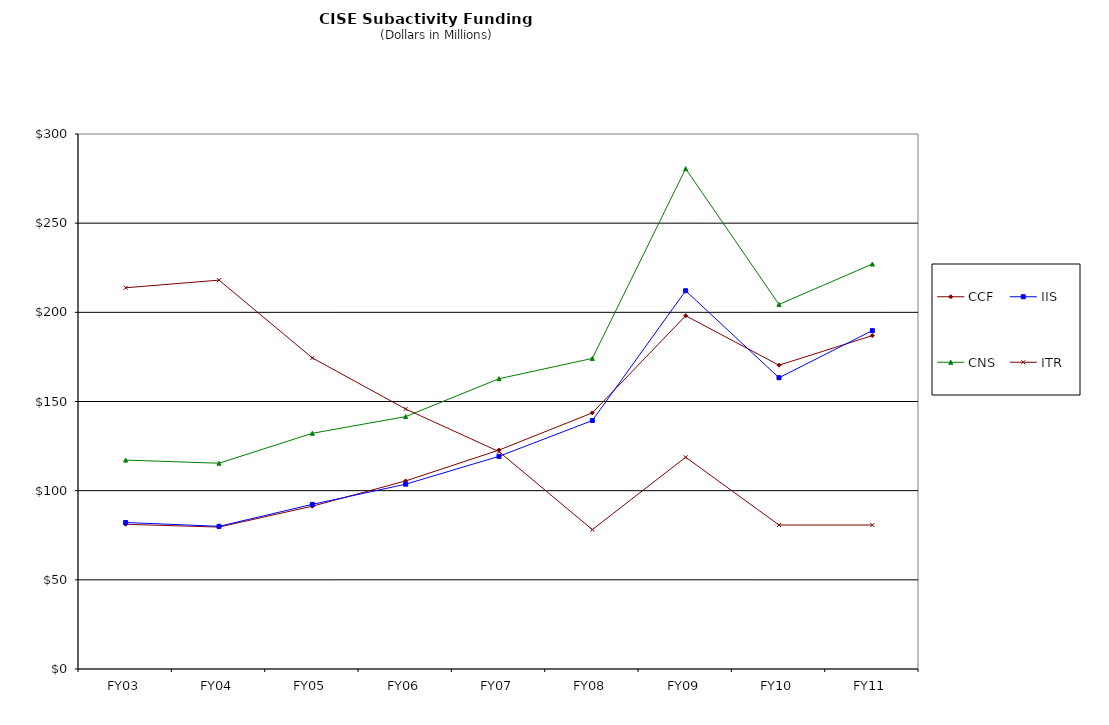
| Category | CCF | IIS | CNS | ITR |
|---|---|---|---|---|
| FY03 | 81.15 | 82.15 | 117.15 | 213.77 |
| FY04 | 79.59 | 80 | 115.39 | 218.06 |
| FY05 | 91.29 | 92.31 | 132.17 | 174.43 |
| FY06 | 105.46 | 103.62 | 141.53 | 145.8 |
| FY07 | 122.76 | 119.25 | 162.77 | 121.9 |
| FY08 | 143.63 | 139.33 | 174.16 | 78.14 |
| FY09 | 198.09 | 212.1 | 280.55 | 118.76 |
| FY10 | 170.35 | 163.32 | 204.42 | 80.74 |
| FY11 | 186.95 | 189.74 | 227.08 | 80.74 |